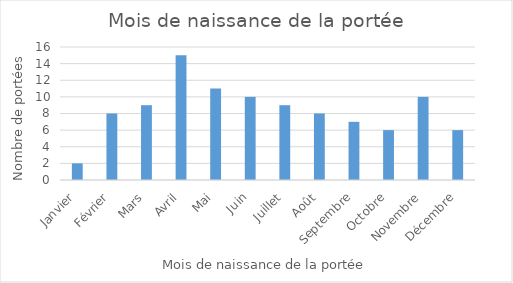
| Category | Series 0 |
|---|---|
| Janvier | 2 |
| Février | 8 |
| Mars | 9 |
| Avril | 15 |
| Mai | 11 |
| Juin | 10 |
| Juillet | 9 |
| Août | 8 |
| Septembre | 7 |
| Octobre | 6 |
| Novembre | 10 |
| Décembre | 6 |